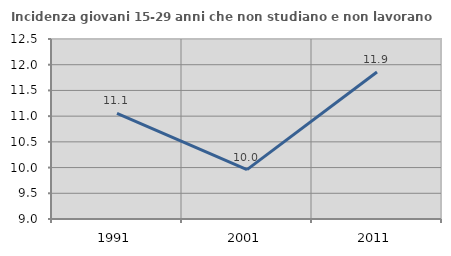
| Category | Incidenza giovani 15-29 anni che non studiano e non lavorano  |
|---|---|
| 1991.0 | 11.053 |
| 2001.0 | 9.96 |
| 2011.0 | 11.859 |